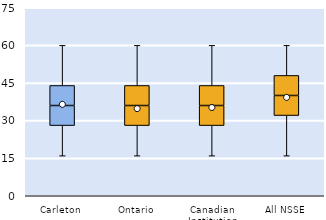
| Category | 25th | 50th | 75th |
|---|---|---|---|
| Carleton | 28 | 8 | 8 |
| Ontario | 28 | 8 | 8 |
| Canadian Institution | 28 | 8 | 8 |
| All NSSE | 32 | 8 | 8 |